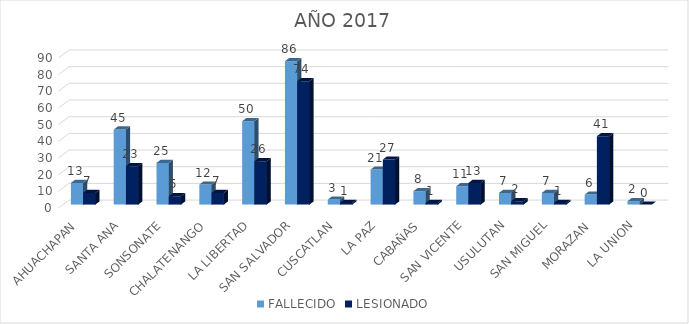
| Category | FALLECIDO | LESIONADO |
|---|---|---|
| AHUACHAPAN | 13 | 7 |
| SANTA ANA | 45 | 23 |
| SONSONATE | 25 | 5 |
| CHALATENANGO | 12 | 7 |
| LA LIBERTAD | 50 | 26 |
| SAN SALVADOR | 86 | 74 |
| CUSCATLAN | 3 | 1 |
| LA PAZ | 21 | 27 |
| CABAÑAS | 8 | 1 |
| SAN VICENTE | 11 | 13 |
| USULUTAN | 7 | 2 |
| SAN MIGUEL | 7 | 1 |
| MORAZAN | 6 | 41 |
| LA UNION | 2 | 0 |